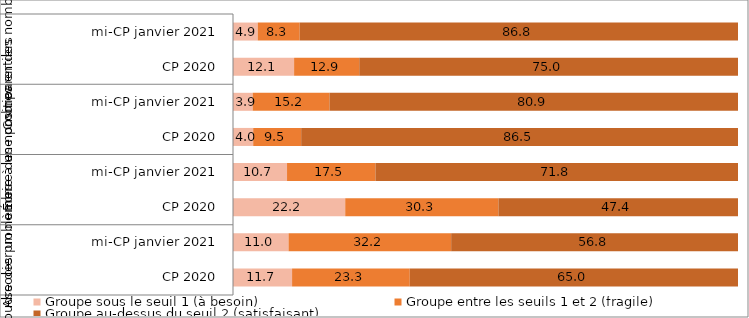
| Category | Groupe sous le seuil 1 (à besoin) | Groupe entre les seuils 1 et 2 (fragile) | Groupe au-dessus du seuil 2 (satisfaisant) |
|---|---|---|---|
| 0 | 11.7 | 23.3 | 65 |
| 1 | 11 | 32.2 | 56.8 |
| 2 | 22.2 | 30.3 | 47.4 |
| 3 | 10.7 | 17.5 | 71.8 |
| 4 | 4 | 9.5 | 86.5 |
| 5 | 3.9 | 15.2 | 80.9 |
| 6 | 12.1 | 12.9 | 75 |
| 7 | 4.9 | 8.3 | 86.8 |